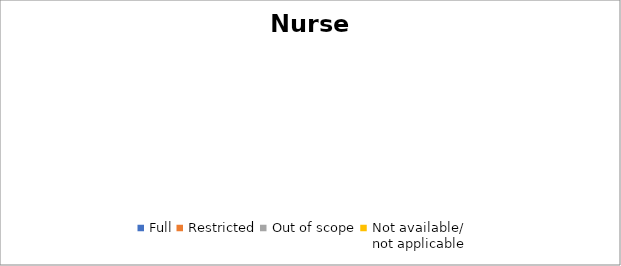
| Category | Nurse practitioner |
|---|---|
| Full | 0 |
| Restricted | 0 |
| Out of scope | 0 |
| Not available/
not applicable | 0 |